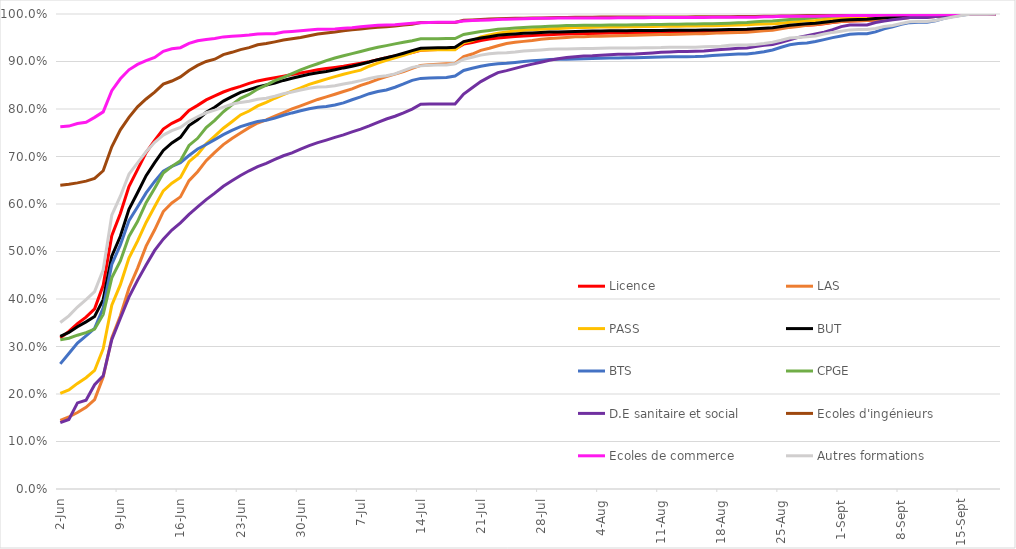
| Category | Licence | LAS | PASS | BUT | BTS | CPGE | D.E sanitaire et social | Ecoles d'ingénieurs | Ecoles de commerce | Autres formations |
|---|---|---|---|---|---|---|---|---|---|---|
| 2022-06-02 | 0.318 | 0.144 | 0.201 | 0.321 | 0.263 | 0.314 | 0.14 | 0.64 | 0.762 | 0.35 |
| 2022-06-03 | 0.332 | 0.152 | 0.209 | 0.33 | 0.285 | 0.317 | 0.146 | 0.642 | 0.764 | 0.365 |
| 2022-06-04 | 0.348 | 0.161 | 0.222 | 0.341 | 0.307 | 0.324 | 0.181 | 0.644 | 0.77 | 0.383 |
| 2022-06-05 | 0.362 | 0.172 | 0.234 | 0.352 | 0.322 | 0.329 | 0.187 | 0.648 | 0.772 | 0.399 |
| 2022-06-06 | 0.379 | 0.188 | 0.25 | 0.363 | 0.338 | 0.337 | 0.219 | 0.654 | 0.782 | 0.415 |
| 2022-06-07 | 0.429 | 0.236 | 0.295 | 0.399 | 0.381 | 0.368 | 0.238 | 0.67 | 0.794 | 0.462 |
| 2022-06-08 | 0.533 | 0.318 | 0.387 | 0.49 | 0.473 | 0.444 | 0.315 | 0.721 | 0.839 | 0.576 |
| 2022-06-09 | 0.58 | 0.365 | 0.43 | 0.532 | 0.514 | 0.48 | 0.36 | 0.756 | 0.864 | 0.616 |
| 2022-06-10 | 0.637 | 0.423 | 0.486 | 0.589 | 0.565 | 0.532 | 0.404 | 0.782 | 0.882 | 0.663 |
| 2022-06-11 | 0.672 | 0.464 | 0.522 | 0.624 | 0.594 | 0.563 | 0.439 | 0.804 | 0.894 | 0.687 |
| 2022-06-12 | 0.708 | 0.511 | 0.561 | 0.66 | 0.623 | 0.603 | 0.472 | 0.821 | 0.902 | 0.71 |
| 2022-06-13 | 0.734 | 0.546 | 0.595 | 0.687 | 0.648 | 0.633 | 0.502 | 0.836 | 0.908 | 0.73 |
| 2022-06-14 | 0.758 | 0.584 | 0.628 | 0.713 | 0.669 | 0.665 | 0.526 | 0.852 | 0.921 | 0.745 |
| 2022-06-15 | 0.77 | 0.602 | 0.644 | 0.729 | 0.679 | 0.679 | 0.545 | 0.859 | 0.927 | 0.755 |
| 2022-06-16 | 0.779 | 0.615 | 0.656 | 0.74 | 0.687 | 0.691 | 0.56 | 0.868 | 0.929 | 0.761 |
| 2022-06-17 | 0.797 | 0.649 | 0.689 | 0.765 | 0.702 | 0.723 | 0.578 | 0.881 | 0.938 | 0.774 |
| 2022-06-18 | 0.808 | 0.668 | 0.704 | 0.777 | 0.716 | 0.738 | 0.594 | 0.892 | 0.944 | 0.784 |
| 2022-06-19 | 0.819 | 0.691 | 0.727 | 0.793 | 0.725 | 0.761 | 0.609 | 0.9 | 0.946 | 0.792 |
| 2022-06-20 | 0.828 | 0.709 | 0.743 | 0.804 | 0.736 | 0.776 | 0.623 | 0.905 | 0.948 | 0.798 |
| 2022-06-21 | 0.836 | 0.725 | 0.76 | 0.817 | 0.746 | 0.794 | 0.637 | 0.915 | 0.952 | 0.804 |
| 2022-06-22 | 0.842 | 0.738 | 0.773 | 0.826 | 0.755 | 0.809 | 0.649 | 0.919 | 0.953 | 0.81 |
| 2022-06-23 | 0.848 | 0.749 | 0.787 | 0.835 | 0.763 | 0.822 | 0.66 | 0.925 | 0.954 | 0.814 |
| 2022-06-24 | 0.854 | 0.761 | 0.796 | 0.841 | 0.768 | 0.831 | 0.67 | 0.929 | 0.956 | 0.816 |
| 2022-06-25 | 0.859 | 0.77 | 0.807 | 0.846 | 0.774 | 0.842 | 0.678 | 0.935 | 0.958 | 0.821 |
| 2022-06-26 | 0.862 | 0.777 | 0.814 | 0.85 | 0.776 | 0.85 | 0.686 | 0.938 | 0.958 | 0.823 |
| 2022-06-27 | 0.866 | 0.785 | 0.823 | 0.855 | 0.781 | 0.86 | 0.694 | 0.941 | 0.959 | 0.827 |
| 2022-06-28 | 0.869 | 0.793 | 0.83 | 0.86 | 0.787 | 0.867 | 0.702 | 0.945 | 0.962 | 0.832 |
| 2022-06-29 | 0.873 | 0.8 | 0.838 | 0.865 | 0.792 | 0.875 | 0.708 | 0.948 | 0.963 | 0.836 |
| 2022-06-30 | 0.876 | 0.807 | 0.845 | 0.869 | 0.796 | 0.882 | 0.715 | 0.95 | 0.965 | 0.84 |
| 2022-07-01 | 0.879 | 0.813 | 0.852 | 0.873 | 0.801 | 0.889 | 0.723 | 0.954 | 0.966 | 0.844 |
| 2022-07-02 | 0.883 | 0.82 | 0.857 | 0.876 | 0.804 | 0.895 | 0.729 | 0.958 | 0.968 | 0.846 |
| 2022-07-03 | 0.885 | 0.825 | 0.863 | 0.879 | 0.805 | 0.902 | 0.735 | 0.96 | 0.968 | 0.847 |
| 2022-07-04 | 0.887 | 0.831 | 0.868 | 0.883 | 0.808 | 0.907 | 0.74 | 0.962 | 0.968 | 0.849 |
| 2022-07-05 | 0.89 | 0.837 | 0.873 | 0.887 | 0.813 | 0.912 | 0.746 | 0.965 | 0.97 | 0.853 |
| 2022-07-06 | 0.893 | 0.842 | 0.878 | 0.89 | 0.819 | 0.917 | 0.752 | 0.967 | 0.971 | 0.856 |
| 2022-07-07 | 0.896 | 0.85 | 0.882 | 0.894 | 0.825 | 0.921 | 0.758 | 0.969 | 0.973 | 0.86 |
| 2022-07-08 | 0.9 | 0.855 | 0.89 | 0.899 | 0.832 | 0.926 | 0.764 | 0.97 | 0.975 | 0.864 |
| 2022-07-09 | 0.904 | 0.862 | 0.897 | 0.904 | 0.837 | 0.93 | 0.772 | 0.972 | 0.976 | 0.868 |
| 2022-07-10 | 0.908 | 0.868 | 0.902 | 0.908 | 0.84 | 0.933 | 0.779 | 0.973 | 0.977 | 0.87 |
| 2022-07-11 | 0.912 | 0.873 | 0.908 | 0.912 | 0.846 | 0.937 | 0.785 | 0.975 | 0.977 | 0.874 |
| 2022-07-12 | 0.915 | 0.879 | 0.913 | 0.917 | 0.853 | 0.941 | 0.792 | 0.977 | 0.979 | 0.881 |
| 2022-07-13 | 0.919 | 0.885 | 0.919 | 0.923 | 0.86 | 0.944 | 0.8 | 0.979 | 0.98 | 0.888 |
| 2022-07-14 | 0.924 | 0.892 | 0.924 | 0.928 | 0.864 | 0.948 | 0.81 | 0.982 | 0.982 | 0.891 |
| 2022-07-15 | 0.925 | 0.893 | 0.924 | 0.928 | 0.865 | 0.948 | 0.81 | 0.982 | 0.982 | 0.892 |
| 2022-07-16 | 0.925 | 0.894 | 0.925 | 0.929 | 0.866 | 0.948 | 0.81 | 0.982 | 0.983 | 0.893 |
| 2022-07-17 | 0.926 | 0.895 | 0.925 | 0.929 | 0.866 | 0.948 | 0.81 | 0.982 | 0.983 | 0.893 |
| 2022-07-18 | 0.926 | 0.896 | 0.925 | 0.93 | 0.87 | 0.948 | 0.811 | 0.982 | 0.983 | 0.895 |
| 2022-07-19 | 0.937 | 0.91 | 0.939 | 0.942 | 0.881 | 0.957 | 0.831 | 0.987 | 0.985 | 0.905 |
| 2022-07-20 | 0.94 | 0.916 | 0.944 | 0.946 | 0.886 | 0.96 | 0.845 | 0.987 | 0.986 | 0.909 |
| 2022-07-21 | 0.944 | 0.923 | 0.952 | 0.949 | 0.89 | 0.963 | 0.858 | 0.989 | 0.987 | 0.913 |
| 2022-07-22 | 0.947 | 0.928 | 0.956 | 0.952 | 0.893 | 0.965 | 0.868 | 0.99 | 0.988 | 0.916 |
| 2022-07-23 | 0.949 | 0.933 | 0.959 | 0.955 | 0.895 | 0.968 | 0.877 | 0.99 | 0.988 | 0.918 |
| 2022-07-24 | 0.951 | 0.938 | 0.962 | 0.957 | 0.896 | 0.969 | 0.881 | 0.991 | 0.989 | 0.919 |
| 2022-07-25 | 0.952 | 0.94 | 0.964 | 0.958 | 0.898 | 0.971 | 0.885 | 0.991 | 0.99 | 0.92 |
| 2022-07-26 | 0.954 | 0.942 | 0.966 | 0.959 | 0.9 | 0.972 | 0.89 | 0.991 | 0.99 | 0.922 |
| 2022-07-27 | 0.955 | 0.944 | 0.967 | 0.96 | 0.901 | 0.973 | 0.894 | 0.992 | 0.991 | 0.923 |
| 2022-07-28 | 0.956 | 0.947 | 0.968 | 0.961 | 0.903 | 0.973 | 0.898 | 0.992 | 0.991 | 0.924 |
| 2022-07-29 | 0.957 | 0.948 | 0.969 | 0.962 | 0.904 | 0.974 | 0.903 | 0.992 | 0.991 | 0.926 |
| 2022-07-30 | 0.957 | 0.95 | 0.97 | 0.962 | 0.905 | 0.975 | 0.906 | 0.992 | 0.991 | 0.926 |
| 2022-07-31 | 0.958 | 0.951 | 0.97 | 0.963 | 0.905 | 0.976 | 0.908 | 0.993 | 0.991 | 0.926 |
| 2022-08-01 | 0.959 | 0.952 | 0.971 | 0.963 | 0.905 | 0.976 | 0.91 | 0.993 | 0.991 | 0.927 |
| 2022-08-02 | 0.959 | 0.952 | 0.971 | 0.964 | 0.906 | 0.976 | 0.911 | 0.993 | 0.992 | 0.927 |
| 2022-08-03 | 0.959 | 0.953 | 0.972 | 0.964 | 0.906 | 0.976 | 0.912 | 0.993 | 0.992 | 0.927 |
| 2022-08-04 | 0.959 | 0.953 | 0.972 | 0.964 | 0.907 | 0.976 | 0.913 | 0.993 | 0.992 | 0.928 |
| 2022-08-05 | 0.96 | 0.954 | 0.973 | 0.965 | 0.907 | 0.977 | 0.914 | 0.994 | 0.992 | 0.928 |
| 2022-08-06 | 0.96 | 0.954 | 0.973 | 0.965 | 0.908 | 0.977 | 0.915 | 0.994 | 0.992 | 0.928 |
| 2022-08-07 | 0.96 | 0.955 | 0.973 | 0.965 | 0.908 | 0.977 | 0.915 | 0.994 | 0.992 | 0.928 |
| 2022-08-08 | 0.961 | 0.955 | 0.973 | 0.965 | 0.908 | 0.977 | 0.916 | 0.994 | 0.992 | 0.929 |
| 2022-08-09 | 0.961 | 0.956 | 0.973 | 0.965 | 0.909 | 0.977 | 0.917 | 0.994 | 0.992 | 0.929 |
| 2022-08-10 | 0.961 | 0.956 | 0.974 | 0.965 | 0.909 | 0.978 | 0.918 | 0.994 | 0.992 | 0.929 |
| 2022-08-11 | 0.961 | 0.957 | 0.974 | 0.965 | 0.91 | 0.978 | 0.919 | 0.994 | 0.992 | 0.929 |
| 2022-08-12 | 0.961 | 0.957 | 0.974 | 0.966 | 0.91 | 0.978 | 0.92 | 0.994 | 0.993 | 0.93 |
| 2022-08-13 | 0.962 | 0.957 | 0.974 | 0.966 | 0.91 | 0.979 | 0.921 | 0.994 | 0.993 | 0.93 |
| 2022-08-14 | 0.962 | 0.958 | 0.975 | 0.966 | 0.91 | 0.979 | 0.921 | 0.994 | 0.993 | 0.93 |
| 2022-08-15 | 0.962 | 0.958 | 0.975 | 0.966 | 0.91 | 0.979 | 0.922 | 0.994 | 0.993 | 0.93 |
| 2022-08-16 | 0.962 | 0.959 | 0.975 | 0.966 | 0.911 | 0.979 | 0.922 | 0.994 | 0.993 | 0.931 |
| 2022-08-17 | 0.963 | 0.959 | 0.975 | 0.966 | 0.912 | 0.98 | 0.924 | 0.994 | 0.993 | 0.932 |
| 2022-08-18 | 0.963 | 0.96 | 0.976 | 0.967 | 0.914 | 0.98 | 0.925 | 0.994 | 0.993 | 0.932 |
| 2022-08-19 | 0.964 | 0.961 | 0.976 | 0.967 | 0.915 | 0.981 | 0.926 | 0.994 | 0.993 | 0.934 |
| 2022-08-20 | 0.964 | 0.961 | 0.977 | 0.968 | 0.916 | 0.982 | 0.928 | 0.995 | 0.993 | 0.935 |
| 2022-08-21 | 0.965 | 0.962 | 0.977 | 0.968 | 0.916 | 0.982 | 0.929 | 0.995 | 0.993 | 0.935 |
| 2022-08-22 | 0.966 | 0.963 | 0.978 | 0.969 | 0.918 | 0.984 | 0.932 | 0.995 | 0.993 | 0.936 |
| 2022-08-23 | 0.967 | 0.965 | 0.979 | 0.97 | 0.921 | 0.985 | 0.934 | 0.995 | 0.994 | 0.938 |
| 2022-08-24 | 0.968 | 0.966 | 0.979 | 0.971 | 0.924 | 0.985 | 0.936 | 0.995 | 0.994 | 0.941 |
| 2022-08-25 | 0.971 | 0.969 | 0.981 | 0.974 | 0.93 | 0.987 | 0.941 | 0.996 | 0.995 | 0.945 |
| 2022-08-26 | 0.973 | 0.972 | 0.982 | 0.976 | 0.935 | 0.988 | 0.946 | 0.996 | 0.995 | 0.949 |
| 2022-08-27 | 0.975 | 0.974 | 0.984 | 0.978 | 0.938 | 0.99 | 0.951 | 0.996 | 0.995 | 0.951 |
| 2022-08-28 | 0.976 | 0.976 | 0.986 | 0.979 | 0.939 | 0.991 | 0.954 | 0.997 | 0.995 | 0.952 |
| 2022-08-29 | 0.977 | 0.978 | 0.987 | 0.981 | 0.942 | 0.993 | 0.958 | 0.997 | 0.995 | 0.954 |
| 2022-08-30 | 0.98 | 0.98 | 0.988 | 0.983 | 0.946 | 0.994 | 0.962 | 0.998 | 0.996 | 0.958 |
| 2022-08-31 | 0.982 | 0.982 | 0.989 | 0.985 | 0.95 | 0.995 | 0.967 | 0.998 | 0.996 | 0.961 |
| 2022-09-01 | 0.984 | 0.984 | 0.991 | 0.987 | 0.954 | 0.997 | 0.973 | 0.998 | 0.996 | 0.964 |
| 2022-09-02 | 0.985 | 0.985 | 0.992 | 0.988 | 0.957 | 0.997 | 0.977 | 0.999 | 0.997 | 0.967 |
| 2022-09-03 | 0.986 | 0.986 | 0.992 | 0.988 | 0.958 | 0.997 | 0.977 | 0.999 | 0.997 | 0.967 |
| 2022-09-04 | 0.986 | 0.986 | 0.992 | 0.989 | 0.959 | 0.998 | 0.977 | 0.999 | 0.997 | 0.967 |
| 2022-09-05 | 0.987 | 0.987 | 0.993 | 0.99 | 0.962 | 0.998 | 0.982 | 0.999 | 0.997 | 0.97 |
| 2022-09-06 | 0.989 | 0.989 | 0.994 | 0.992 | 0.969 | 0.998 | 0.985 | 0.999 | 0.998 | 0.973 |
| 2022-09-07 | 0.99 | 0.99 | 0.995 | 0.993 | 0.973 | 0.998 | 0.988 | 0.999 | 0.998 | 0.976 |
| 2022-09-08 | 0.991 | 0.992 | 0.995 | 0.994 | 0.978 | 0.999 | 0.99 | 0.999 | 0.998 | 0.98 |
| 2022-09-09 | 0.993 | 0.993 | 0.996 | 0.996 | 0.982 | 0.999 | 0.992 | 0.999 | 0.998 | 0.983 |
| 2022-09-10 | 0.994 | 0.993 | 0.997 | 0.996 | 0.983 | 0.999 | 0.993 | 0.999 | 0.999 | 0.984 |
| 2022-09-11 | 0.994 | 0.994 | 0.997 | 0.996 | 0.983 | 0.999 | 0.993 | 0.999 | 0.999 | 0.984 |
| 2022-09-12 | 0.995 | 0.994 | 0.997 | 0.997 | 0.986 | 0.999 | 0.995 | 1 | 0.999 | 0.986 |
| 2022-09-13 | 0.996 | 0.996 | 0.998 | 0.998 | 0.991 | 0.999 | 0.996 | 1 | 0.999 | 0.99 |
| 2022-09-14 | 0.998 | 0.998 | 0.999 | 0.999 | 0.994 | 1 | 0.998 | 1 | 0.999 | 0.994 |
| 2022-09-15 | 0.999 | 0.999 | 1 | 0.999 | 0.997 | 1 | 0.999 | 1 | 1 | 0.997 |
| 2022-09-16 | 1 | 1 | 1 | 1 | 1 | 1 | 1 | 1 | 1 | 0.999 |
| 2022-09-17 | 1 | 1 | 1 | 1 | 1 | 1 | 1 | 1 | 1 | 0.999 |
| 2022-09-18 | 1 | 1 | 1 | 1 | 1 | 1 | 1 | 1 | 1 | 0.999 |
| 2022-09-19 | 1 | 1 | 1 | 1 | 1 | 1 | 1 | 1 | 1 | 1 |